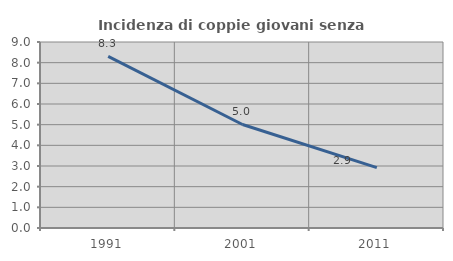
| Category | Incidenza di coppie giovani senza figli |
|---|---|
| 1991.0 | 8.308 |
| 2001.0 | 5.009 |
| 2011.0 | 2.919 |